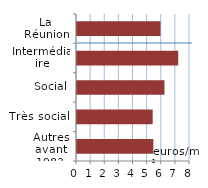
| Category | Series 0 |
|---|---|
| Autres avant 1983 | 5.404 |
| Très social | 5.359 |
| Social | 6.194 |
| Intermédiaire | 7.167 |
| La Réunion | 5.913 |